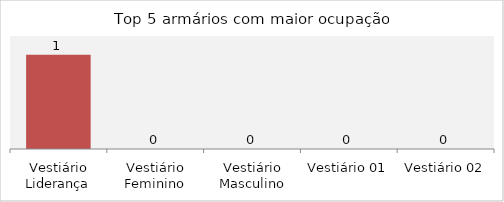
| Category | Vagas ocupadas |
|---|---|
| Vestiário Liderança | 1 |
| Vestiário Feminino | 0 |
| Vestiário Masculino | 0 |
| Vestiário 01 | 0 |
| Vestiário 02 | 0 |